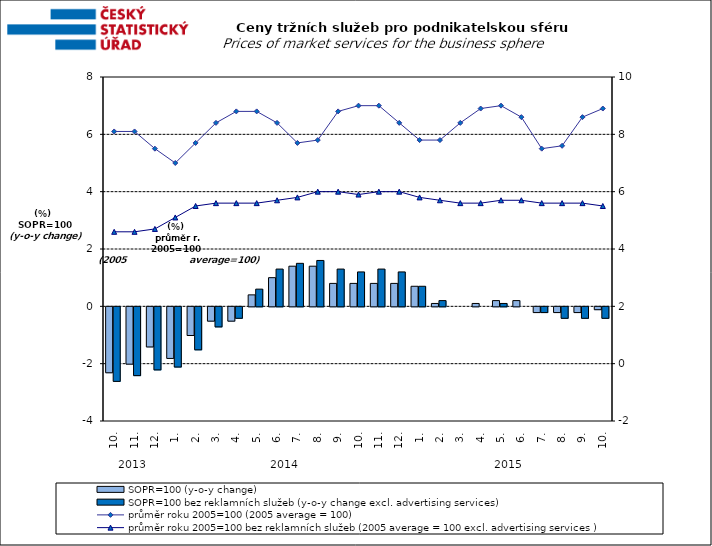
| Category | SOPR=100 (y-o-y change)   | SOPR=100 bez reklamních služeb (y-o-y change excl. advertising services)   |
|---|---|---|
| 0 | -2.3 | -2.6 |
| 1 | -2 | -2.4 |
| 2 | -1.4 | -2.2 |
| 3 | -1.8 | -2.1 |
| 4 | -1 | -1.5 |
| 5 | -0.5 | -0.7 |
| 6 | -0.5 | -0.4 |
| 7 | 0.4 | 0.6 |
| 8 | 1 | 1.3 |
| 9 | 1.4 | 1.5 |
| 10 | 1.4 | 1.6 |
| 11 | 0.8 | 1.3 |
| 12 | 0.8 | 1.2 |
| 13 | 0.8 | 1.3 |
| 14 | 0.8 | 1.2 |
| 15 | 0.7 | 0.7 |
| 16 | 0.1 | 0.2 |
| 17 | 0 | 0 |
| 18 | 0.1 | 0 |
| 19 | 0.2 | 0.1 |
| 20 | 0.2 | 0 |
| 21 | -0.2 | -0.2 |
| 22 | -0.2 | -0.4 |
| 23 | -0.2 | -0.4 |
| 24 | -0.1 | -0.4 |